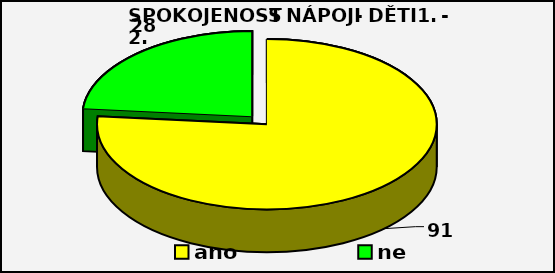
| Category | Series 0 |
|---|---|
| ano | 91 |
| ne | 28 |